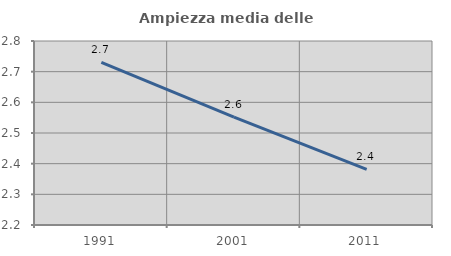
| Category | Ampiezza media delle famiglie |
|---|---|
| 1991.0 | 2.731 |
| 2001.0 | 2.552 |
| 2011.0 | 2.382 |